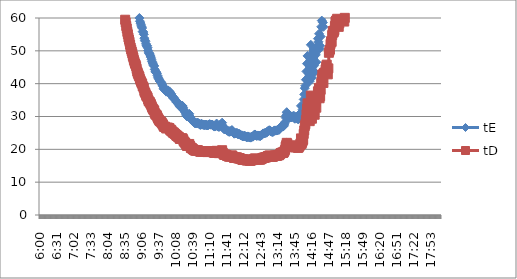
| Category | tE | tD |
|---|---|---|
| 0.25 | 17882.69 | 12549.256 |
| 0.25069444444444444 | 17882.69 | 12549.256 |
| 0.2513888888888889 | 17882.69 | 12549.256 |
| 0.2520833333333333 | 17882.69 | 12549.256 |
| 0.25277777777777777 | 17882.69 | 12549.256 |
| 0.2534722222222222 | 17882.69 | 12549.256 |
| 0.25416666666666665 | 17882.69 | 12549.256 |
| 0.2548611111111111 | 17882.69 | 12549.256 |
| 0.2555555555555556 | 17882.69 | 12549.256 |
| 0.25625000000000003 | 17882.69 | 12549.256 |
| 0.2569444444444445 | 17882.69 | 12549.256 |
| 0.2576388888888889 | 17882.69 | 12549.256 |
| 0.25833333333333336 | 17882.69 | 12549.256 |
| 0.2590277777777778 | 8941.345 | 6274.628 |
| 0.25972222222222224 | 8941.345 | 6274.628 |
| 0.2604166666666667 | 8941.345 | 6274.628 |
| 0.2611111111111111 | 8941.345 | 6274.628 |
| 0.26180555555555557 | 8941.345 | 6274.628 |
| 0.2625 | 8941.345 | 6274.628 |
| 0.26319444444444445 | 5960.897 | 4183.085 |
| 0.2638888888888889 | 5960.897 | 4183.085 |
| 0.26458333333333334 | 5960.897 | 4183.085 |
| 0.2652777777777778 | 5960.897 | 4183.085 |
| 0.2659722222222222 | 5960.897 | 4183.085 |
| 0.26666666666666666 | 5960.897 | 4183.085 |
| 0.2673611111111111 | 4470.672 | 3137.314 |
| 0.26805555555555555 | 4470.672 | 3137.314 |
| 0.26875 | 4470.672 | 3137.314 |
| 0.26944444444444443 | 4470.672 | 3137.314 |
| 0.2701388888888889 | 3576.538 | 2509.851 |
| 0.2708333333333333 | 3576.538 | 2509.851 |
| 0.27152777777777776 | 3576.538 | 2509.851 |
| 0.2722222222222222 | 2980.448 | 2091.543 |
| 0.27291666666666664 | 2980.448 | 2091.543 |
| 0.2736111111111111 | 2980.448 | 2091.543 |
| 0.2743055555555555 | 2554.67 | 1792.751 |
| 0.27499999999999997 | 2554.67 | 1792.751 |
| 0.27569444444444446 | 2554.67 | 1792.751 |
| 0.27638888888888885 | 2235.336 | 1568.657 |
| 0.27708333333333335 | 2235.336 | 1568.657 |
| 0.2777777777777778 | 1986.966 | 1394.362 |
| 0.27847222222222223 | 1986.966 | 1394.362 |
| 0.2791666666666667 | 1788.269 | 1254.926 |
| 0.2798611111111111 | 1788.269 | 1254.926 |
| 0.28055555555555556 | 1625.699 | 1140.841 |
| 0.28125 | 1625.699 | 1140.841 |
| 0.28194444444444444 | 1490.224 | 1045.771 |
| 0.2826388888888889 | 1490.224 | 1045.771 |
| 0.2833333333333333 | 1375.592 | 965.327 |
| 0.28402777777777777 | 1277.335 | 896.375 |
| 0.2847222222222222 | 1277.335 | 896.375 |
| 0.28541666666666665 | 1192.179 | 836.617 |
| 0.28611111111111115 | 1117.668 | 784.328 |
| 0.28680555555555554 | 1051.923 | 738.192 |
| 0.28750000000000003 | 1051.923 | 738.192 |
| 0.2881944444444445 | 993.483 | 697.181 |
| 0.2888888888888889 | 941.194 | 660.487 |
| 0.28958333333333336 | 894.134 | 627.463 |
| 0.2902777777777778 | 851.557 | 597.584 |
| 0.29097222222222224 | 812.85 | 570.421 |
| 0.2916666666666667 | 777.508 | 545.62 |
| 0.2923611111111111 | 745.112 | 522.886 |
| 0.29305555555555557 | 715.308 | 501.97 |
| 0.29375 | 687.796 | 482.664 |
| 0.29444444444444445 | 662.322 | 464.787 |
| 0.2951388888888889 | 638.667 | 448.188 |
| 0.29583333333333334 | 616.644 | 432.733 |
| 0.2965277777777778 | 596.09 | 418.309 |
| 0.2972222222222222 | 576.861 | 404.815 |
| 0.29791666666666666 | 558.834 | 392.164 |
| 0.2986111111111111 | 541.9 | 380.28 |
| 0.29930555555555555 | 525.961 | 369.096 |
| 0.3 | 510.934 | 358.55 |
| 0.30069444444444443 | 496.741 | 348.59 |
| 0.3013888888888889 | 483.316 | 339.169 |
| 0.3020833333333333 | 458.531 | 321.776 |
| 0.30277777777777776 | 447.067 | 313.731 |
| 0.3034722222222222 | 436.163 | 306.079 |
| 0.30416666666666664 | 425.778 | 298.792 |
| 0.3048611111111111 | 415.877 | 291.843 |
| 0.3055555555555555 | 406.425 | 285.21 |
| 0.30624999999999997 | 388.754 | 272.81 |
| 0.3069444444444444 | 380.483 | 267.005 |
| 0.3076388888888889 | 372.556 | 261.443 |
| 0.30833333333333335 | 364.953 | 256.107 |
| 0.3090277777777778 | 357.654 | 250.985 |
| 0.30972222222222223 | 343.898 | 241.332 |
| 0.3104166666666667 | 337.409 | 236.778 |
| 0.3111111111111111 | 331.161 | 232.394 |
| 0.31180555555555556 | 319.334 | 224.094 |
| 0.3125 | 313.731 | 220.162 |
| 0.31319444444444444 | 308.322 | 216.366 |
| 0.3138888888888889 | 298.045 | 209.154 |
| 0.3145833333333333 | 293.159 | 205.726 |
| 0.31527777777777777 | 283.852 | 199.195 |
| 0.3159722222222222 | 279.417 | 196.082 |
| 0.31666666666666665 | 270.95 | 190.14 |
| 0.31736111111111115 | 262.981 | 184.548 |
| 0.31805555555555554 | 251.869 | 176.75 |
| 0.31875000000000003 | 241.658 | 169.585 |
| 0.3194444444444445 | 226.363 | 158.851 |
| 0.3201388888888889 | 215.454 | 151.196 |
| 0.32083333333333336 | 207.938 | 145.922 |
| 0.3215277777777778 | 203.212 | 142.605 |
| 0.32222222222222224 | 196.513 | 137.904 |
| 0.3229166666666667 | 190.241 | 133.503 |
| 0.3236111111111111 | 184.358 | 129.374 |
| 0.32430555555555557 | 178.827 | 125.493 |
| 0.325 | 175.32 | 123.032 |
| 0.32569444444444445 | 170.311 | 119.517 |
| 0.3263888888888889 | 165.58 | 116.197 |
| 0.32708333333333334 | 161.105 | 113.056 |
| 0.3277777777777778 | 156.866 | 110.081 |
| 0.3284722222222222 | 152.844 | 107.259 |
| 0.32916666666666666 | 149.022 | 104.577 |
| 0.3298611111111111 | 145.388 | 102.026 |
| 0.33055555555555555 | 141.926 | 99.597 |
| 0.33125 | 138.626 | 97.281 |
| 0.33194444444444443 | 135.475 | 95.07 |
| 0.3326388888888889 | 133.453 | 93.651 |
| 0.3333333333333333 | 130.531 | 91.6 |
| 0.3340277777777778 | 128.652 | 90.282 |
| 0.3347222222222222 | 126.828 | 89.002 |
| 0.3354166666666667 | 125.054 | 87.757 |
| 0.3361111111111111 | 123.329 | 86.547 |
| 0.3368055555555556 | 122.484 | 85.954 |
| 0.33749999999999997 | 121.651 | 85.369 |
| 0.33819444444444446 | 119.218 | 83.662 |
| 0.33888888888888885 | 117.649 | 82.561 |
| 0.33958333333333335 | 116.121 | 81.489 |
| 0.34027777777777773 | 115.372 | 80.963 |
| 0.34097222222222223 | 114.633 | 80.444 |
| 0.3416666666666666 | 113.182 | 79.426 |
| 0.3423611111111111 | 111.767 | 78.433 |
| 0.3430555555555555 | 111.073 | 77.946 |
| 0.34375 | 109.71 | 76.989 |
| 0.3444444444444445 | 108.38 | 76.056 |
| 0.3451388888888889 | 107.082 | 75.145 |
| 0.3458333333333334 | 105.815 | 74.256 |
| 0.34652777777777777 | 103.969 | 72.961 |
| 0.34722222222222227 | 102.187 | 71.71 |
| 0.34791666666666665 | 101.032 | 70.9 |
| 0.34861111111111115 | 99.903 | 70.108 |
| 0.34930555555555554 | 98.257 | 68.952 |
| 0.35000000000000003 | 97.189 | 68.202 |
| 0.3506944444444444 | 95.629 | 67.108 |
| 0.3513888888888889 | 94.119 | 66.049 |
| 0.3520833333333333 | 93.139 | 65.361 |
| 0.3527777777777778 | 92.179 | 64.687 |
| 0.3534722222222222 | 91.238 | 64.027 |
| 0.3541666666666667 | 90.317 | 63.38 |
| 0.3548611111111111 | 88.969 | 62.434 |
| 0.35555555555555557 | 88.092 | 61.819 |
| 0.35625 | 86.809 | 60.919 |
| 0.35694444444444445 | 85.974 | 60.333 |
| 0.3576388888888889 | 84.752 | 59.475 |
| 0.35833333333333334 | 83.564 | 58.641 |
| 0.3590277777777778 | 82.031 | 57.565 |
| 0.3597222222222222 | 80.917 | 56.784 |
| 0.36041666666666666 | 79.479 | 55.774 |
| 0.3611111111111111 | 78.433 | 55.041 |
| 0.36180555555555555 | 77.081 | 54.092 |
| 0.3625 | 76.097 | 53.401 |
| 0.36319444444444443 | 75.137 | 52.728 |
| 0.3638888888888889 | 73.895 | 51.856 |
| 0.3645833333333333 | 72.694 | 51.013 |
| 0.3652777777777778 | 71.818 | 50.399 |
| 0.3659722222222222 | 70.963 | 49.799 |
| 0.3666666666666667 | 70.128 | 49.213 |
| 0.3673611111111111 | 69.045 | 48.453 |
| 0.3680555555555556 | 68.255 | 47.898 |
| 0.36874999999999997 | 67.228 | 47.178 |
| 0.36944444444444446 | 66.478 | 46.652 |
| 0.37013888888888885 | 65.745 | 46.137 |
| 0.37083333333333335 | 65.265 | 45.8 |
| 0.37152777777777773 | 64.558 | 45.304 |
| 0.37222222222222223 | 63.414 | 44.501 |
| 0.3729166666666666 | 62.309 | 43.726 |
| 0.3736111111111111 | 61.664 | 43.273 |
| 0.3743055555555555 | 61.033 | 42.83 |
| 0.375 | 60.414 | 42.396 |
| 0.3756944444444445 | 60.009 | 42.112 |
| 0.3763888888888889 | 59.019 | 41.417 |
| 0.3770833333333334 | 58.44 | 41.011 |
| 0.37777777777777777 | 57.873 | 40.612 |
| 0.37847222222222227 | 57.316 | 40.222 |
| 0.37916666666666665 | 56.951 | 39.966 |
| 0.37986111111111115 | 55.883 | 39.216 |
| 0.38055555555555554 | 55.709 | 39.094 |
| 0.38125000000000003 | 55.024 | 38.613 |
| 0.3819444444444444 | 53.864 | 37.799 |
| 0.3826388888888889 | 53.222 | 37.349 |
| 0.3833333333333333 | 52.907 | 37.128 |
| 0.3840277777777778 | 52.136 | 36.587 |
| 0.3847222222222222 | 51.535 | 36.165 |
| 0.3854166666666667 | 51.535 | 36.165 |
| 0.3861111111111111 | 50.948 | 35.753 |
| 0.38680555555555557 | 50.092 | 35.152 |
| 0.3875 | 49.4 | 34.666 |
| 0.38819444444444445 | 49.264 | 34.571 |
| 0.3888888888888889 | 48.994 | 34.382 |
| 0.38958333333333334 | 48.463 | 34.009 |
| 0.3902777777777778 | 48.072 | 33.735 |
| 0.3909722222222222 | 47.434 | 33.287 |
| 0.39166666666666666 | 46.813 | 32.851 |
| 0.3923611111111111 | 46.328 | 32.511 |
| 0.39305555555555555 | 45.971 | 32.26 |
| 0.39375 | 45.503 | 31.932 |
| 0.39444444444444443 | 45.388 | 31.851 |
| 0.3951388888888889 | 44.374 | 31.14 |
| 0.3958333333333333 | 43.83 | 30.758 |
| 0.3965277777777778 | 43.51 | 30.533 |
| 0.3972222222222222 | 43.51 | 30.533 |
| 0.3979166666666667 | 43.091 | 30.239 |
| 0.3986111111111111 | 42.477 | 29.808 |
| 0.3993055555555556 | 41.978 | 29.458 |
| 0.39999999999999997 | 41.588 | 29.184 |
| 0.40069444444444446 | 41.204 | 28.915 |
| 0.40138888888888885 | 40.828 | 28.651 |
| 0.40208333333333335 | 40.642 | 28.521 |
| 0.40277777777777773 | 40.55 | 28.456 |
| 0.40347222222222223 | 40.276 | 28.264 |
| 0.4041666666666666 | 39.917 | 28.012 |
| 0.4048611111111111 | 39.563 | 27.764 |
| 0.4055555555555555 | 39.216 | 27.52 |
| 0.40625 | 38.624 | 27.104 |
| 0.4069444444444445 | 38.293 | 26.872 |
| 0.4076388888888889 | 38.211 | 26.815 |
| 0.4083333333333334 | 38.293 | 26.872 |
| 0.40902777777777777 | 37.967 | 26.644 |
| 0.40972222222222227 | 37.569 | 26.364 |
| 0.41041666666666665 | 37.727 | 26.475 |
| 0.41111111111111115 | 37.727 | 26.475 |
| 0.41180555555555554 | 37.967 | 26.644 |
| 0.41250000000000003 | 37.727 | 26.475 |
| 0.4131944444444444 | 37.648 | 26.419 |
| 0.4138888888888889 | 37.648 | 26.419 |
| 0.4145833333333333 | 37.024 | 25.982 |
| 0.4152777777777778 | 36.645 | 25.716 |
| 0.4159722222222222 | 36.948 | 25.928 |
| 0.4166666666666667 | 36.347 | 25.507 |
| 0.4173611111111111 | 36.2 | 25.403 |
| 0.41805555555555557 | 35.981 | 25.25 |
| 0.41875 | 35.552 | 24.949 |
| 0.41944444444444445 | 35.694 | 25.048 |
| 0.4201388888888889 | 35.341 | 24.801 |
| 0.42083333333333334 | 35.202 | 24.703 |
| 0.4215277777777778 | 34.995 | 24.558 |
| 0.4222222222222222 | 34.724 | 24.367 |
| 0.42291666666666666 | 34.324 | 24.087 |
| 0.4236111111111111 | 34.456 | 24.18 |
| 0.42430555555555555 | 34.127 | 23.949 |
| 0.425 | 33.805 | 23.723 |
| 0.42569444444444443 | 33.869 | 23.768 |
| 0.4263888888888889 | 33.426 | 23.457 |
| 0.4270833333333333 | 32.994 | 23.154 |
| 0.4277777777777778 | 33.055 | 23.196 |
| 0.4284722222222222 | 33.116 | 23.239 |
| 0.4291666666666667 | 33.055 | 23.196 |
| 0.4298611111111111 | 33.301 | 23.369 |
| 0.4305555555555556 | 33.178 | 23.282 |
| 0.43124999999999997 | 32.633 | 22.9 |
| 0.43194444444444446 | 31.933 | 22.409 |
| 0.43263888888888885 | 31.82 | 22.33 |
| 0.43333333333333335 | 31.428 | 22.055 |
| 0.43402777777777773 | 31.209 | 21.901 |
| 0.43472222222222223 | 30.726 | 21.562 |
| 0.4354166666666666 | 30.258 | 21.234 |
| 0.4361111111111111 | 30.005 | 21.056 |
| 0.4368055555555555 | 30.055 | 21.091 |
| 0.4375 | 30.413 | 21.342 |
| 0.4381944444444445 | 30.465 | 21.379 |
| 0.4388888888888889 | 30.832 | 21.637 |
| 0.4395833333333334 | 30.055 | 21.091 |
| 0.44027777777777777 | 29.755 | 20.881 |
| 0.44097222222222227 | 29.125 | 20.439 |
| 0.44166666666666665 | 29.03 | 20.372 |
| 0.44236111111111115 | 29.03 | 20.372 |
| 0.44305555555555554 | 28.704 | 20.143 |
| 0.44375000000000003 | 28.521 | 20.015 |
| 0.4444444444444444 | 28.385 | 19.919 |
| 0.4451388888888889 | 28.206 | 19.794 |
| 0.4458333333333333 | 27.985 | 19.639 |
| 0.4465277777777778 | 27.985 | 19.639 |
| 0.4472222222222222 | 27.942 | 19.608 |
| 0.4479166666666667 | 27.985 | 19.639 |
| 0.4486111111111111 | 27.985 | 19.639 |
| 0.44930555555555557 | 28.073 | 19.701 |
| 0.45 | 28.073 | 19.701 |
| 0.45069444444444445 | 27.855 | 19.547 |
| 0.4513888888888889 | 27.725 | 19.456 |
| 0.45208333333333334 | 27.768 | 19.486 |
| 0.4527777777777778 | 27.47 | 19.277 |
| 0.4534722222222222 | 27.47 | 19.277 |
| 0.45416666666666666 | 27.768 | 19.486 |
| 0.4548611111111111 | 27.682 | 19.426 |
| 0.45555555555555555 | 27.597 | 19.366 |
| 0.45625 | 27.512 | 19.307 |
| 0.45694444444444443 | 27.47 | 19.277 |
| 0.4576388888888889 | 27.427 | 19.247 |
| 0.4583333333333333 | 27.427 | 19.247 |
| 0.4590277777777778 | 27.427 | 19.247 |
| 0.4597222222222222 | 27.512 | 19.307 |
| 0.4604166666666667 | 27.47 | 19.277 |
| 0.4611111111111111 | 27.344 | 19.188 |
| 0.4618055555555556 | 27.302 | 19.159 |
| 0.46249999999999997 | 27.344 | 19.188 |
| 0.46319444444444446 | 27.427 | 19.247 |
| 0.46388888888888885 | 27.554 | 19.336 |
| 0.46458333333333335 | 27.682 | 19.426 |
| 0.46527777777777773 | 27.597 | 19.366 |
| 0.46597222222222223 | 27.512 | 19.307 |
| 0.4666666666666666 | 27.554 | 19.336 |
| 0.4673611111111111 | 27.512 | 19.307 |
| 0.4680555555555555 | 27.554 | 19.336 |
| 0.46875 | 27.302 | 19.159 |
| 0.4694444444444445 | 27.219 | 19.101 |
| 0.4701388888888889 | 27.095 | 19.014 |
| 0.4708333333333334 | 26.932 | 18.899 |
| 0.47152777777777777 | 27.095 | 19.014 |
| 0.47222222222222227 | 27.054 | 18.985 |
| 0.47291666666666665 | 27.177 | 19.072 |
| 0.47361111111111115 | 27.855 | 19.547 |
| 0.47430555555555554 | 27.344 | 19.188 |
| 0.47500000000000003 | 27.013 | 18.957 |
| 0.4756944444444444 | 26.932 | 18.899 |
| 0.4763888888888889 | 26.851 | 18.843 |
| 0.4770833333333333 | 26.891 | 18.871 |
| 0.4777777777777778 | 27.385 | 19.218 |
| 0.4784722222222222 | 27.26 | 19.13 |
| 0.4791666666666667 | 27.512 | 19.307 |
| 0.4798611111111111 | 27.554 | 19.336 |
| 0.48055555555555557 | 28.117 | 19.732 |
| 0.48125 | 27.136 | 19.043 |
| 0.48194444444444445 | 26.651 | 18.702 |
| 0.4826388888888889 | 26.259 | 18.428 |
| 0.48333333333333334 | 26.106 | 18.32 |
| 0.4840277777777778 | 26.221 | 18.401 |
| 0.4847222222222222 | 26.144 | 18.347 |
| 0.48541666666666666 | 26.068 | 18.293 |
| 0.4861111111111111 | 25.842 | 18.135 |
| 0.48680555555555555 | 25.73 | 18.056 |
| 0.4875 | 25.694 | 18.031 |
| 0.48819444444444443 | 25.583 | 17.953 |
| 0.4888888888888889 | 25.402 | 17.826 |
| 0.4895833333333333 | 25.33 | 17.775 |
| 0.4902777777777778 | 25.547 | 17.928 |
| 0.4909722222222222 | 25.402 | 17.826 |
| 0.4916666666666667 | 25.438 | 17.851 |
| 0.4923611111111111 | 25.694 | 18.031 |
| 0.4930555555555556 | 25.879 | 18.161 |
| 0.49374999999999997 | 25.547 | 17.928 |
| 0.49444444444444446 | 25.366 | 17.8 |
| 0.49513888888888885 | 24.976 | 17.527 |
| 0.49583333333333335 | 24.768 | 17.381 |
| 0.49652777777777773 | 24.941 | 17.502 |
| 0.49722222222222223 | 24.941 | 17.502 |
| 0.4979166666666666 | 24.872 | 17.454 |
| 0.4986111111111111 | 24.837 | 17.43 |
| 0.4993055555555555 | 25.046 | 17.576 |
| 0.5 | 24.803 | 17.405 |
| 0.5006944444444444 | 24.564 | 17.238 |
| 0.5013888888888889 | 24.632 | 17.285 |
| 0.5020833333333333 | 24.666 | 17.309 |
| 0.5027777777777778 | 24.632 | 17.285 |
| 0.5034722222222222 | 24.43 | 17.144 |
| 0.5041666666666667 | 24.363 | 17.097 |
| 0.5048611111111111 | 24.231 | 17.004 |
| 0.5055555555555555 | 24.264 | 17.027 |
| 0.50625 | 23.971 | 16.822 |
| 0.5069444444444444 | 23.939 | 16.8 |
| 0.5076388888888889 | 23.971 | 16.822 |
| 0.5083333333333333 | 24.133 | 16.936 |
| 0.5090277777777777 | 24.036 | 16.867 |
| 0.5097222222222222 | 24.036 | 16.867 |
| 0.5104166666666666 | 23.907 | 16.777 |
| 0.5111111111111112 | 23.78 | 16.688 |
| 0.5118055555555555 | 23.686 | 16.622 |
| 0.5125000000000001 | 23.717 | 16.644 |
| 0.5131944444444444 | 23.939 | 16.8 |
| 0.513888888888889 | 23.907 | 16.777 |
| 0.5145833333333333 | 23.686 | 16.622 |
| 0.5152777777777778 | 23.654 | 16.6 |
| 0.5159722222222222 | 23.623 | 16.578 |
| 0.5166666666666667 | 23.561 | 16.534 |
| 0.517361111111111 | 23.78 | 16.688 |
| 0.5180555555555556 | 23.78 | 16.688 |
| 0.5187499999999999 | 23.875 | 16.755 |
| 0.5194444444444445 | 23.844 | 16.732 |
| 0.5201388888888888 | 23.939 | 16.8 |
| 0.5208333333333334 | 24.264 | 17.027 |
| 0.5215277777777778 | 24.43 | 17.144 |
| 0.5222222222222223 | 24.53 | 17.214 |
| 0.5229166666666667 | 24.397 | 17.12 |
| 0.5236111111111111 | 24.231 | 17.004 |
| 0.5243055555555556 | 24.101 | 16.913 |
| 0.525 | 24.166 | 16.958 |
| 0.5256944444444445 | 24.231 | 17.004 |
| 0.5263888888888889 | 24.166 | 16.958 |
| 0.5270833333333333 | 24.166 | 16.958 |
| 0.5277777777777778 | 24.133 | 16.936 |
| 0.5284722222222222 | 24.101 | 16.913 |
| 0.5291666666666667 | 24.068 | 16.89 |
| 0.5298611111111111 | 24.231 | 17.004 |
| 0.5305555555555556 | 24.43 | 17.144 |
| 0.53125 | 24.463 | 17.167 |
| 0.5319444444444444 | 24.734 | 17.357 |
| 0.5326388888888889 | 24.837 | 17.43 |
| 0.5333333333333333 | 24.837 | 17.43 |
| 0.5340277777777778 | 24.837 | 17.43 |
| 0.5347222222222222 | 24.941 | 17.502 |
| 0.5354166666666667 | 25.046 | 17.576 |
| 0.5361111111111111 | 25.046 | 17.576 |
| 0.5368055555555555 | 25.081 | 17.601 |
| 0.5375 | 25.222 | 17.7 |
| 0.5381944444444444 | 25.438 | 17.851 |
| 0.5388888888888889 | 25.62 | 17.979 |
| 0.5395833333333333 | 25.62 | 17.979 |
| 0.5402777777777777 | 25.805 | 18.109 |
| 0.5409722222222222 | 25.768 | 18.083 |
| 0.5416666666666666 | 25.62 | 17.979 |
| 0.5423611111111112 | 25.474 | 17.876 |
| 0.5430555555555555 | 25.438 | 17.851 |
| 0.5437500000000001 | 25.33 | 17.775 |
| 0.5444444444444444 | 25.33 | 17.775 |
| 0.545138888888889 | 25.33 | 17.775 |
| 0.5458333333333333 | 25.474 | 17.876 |
| 0.5465277777777778 | 25.694 | 18.031 |
| 0.5472222222222222 | 25.768 | 18.083 |
| 0.5479166666666667 | 25.73 | 18.056 |
| 0.548611111111111 | 25.694 | 18.031 |
| 0.5493055555555556 | 25.768 | 18.083 |
| 0.5499999999999999 | 25.768 | 18.083 |
| 0.5506944444444445 | 25.768 | 18.083 |
| 0.5513888888888888 | 25.917 | 18.187 |
| 0.5520833333333334 | 26.03 | 18.267 |
| 0.5527777777777778 | 25.955 | 18.214 |
| 0.5534722222222223 | 26.221 | 18.401 |
| 0.5541666666666667 | 26.493 | 18.591 |
| 0.5548611111111111 | 26.851 | 18.843 |
| 0.5555555555555556 | 26.891 | 18.871 |
| 0.55625 | 26.972 | 18.928 |
| 0.5569444444444445 | 27.177 | 19.072 |
| 0.5576388888888889 | 26.932 | 18.899 |
| 0.5583333333333333 | 27.013 | 18.957 |
| 0.5590277777777778 | 27.344 | 19.188 |
| 0.5597222222222222 | 27.768 | 19.486 |
| 0.5604166666666667 | 28.295 | 19.856 |
| 0.5611111111111111 | 29.656 | 20.811 |
| 0.5618055555555556 | 30.31 | 21.27 |
| 0.5625 | 31.318 | 21.978 |
| 0.5631944444444444 | 31.046 | 21.787 |
| 0.5638888888888889 | 30.005 | 21.056 |
| 0.5645833333333333 | 29.705 | 20.846 |
| 0.5652777777777778 | 29.755 | 20.881 |
| 0.5659722222222222 | 29.705 | 20.846 |
| 0.5666666666666667 | 29.755 | 20.881 |
| 0.5673611111111111 | 29.705 | 20.846 |
| 0.5680555555555555 | 29.705 | 20.846 |
| 0.56875 | 29.854 | 20.95 |
| 0.5694444444444444 | 30.055 | 21.091 |
| 0.5701388888888889 | 29.854 | 20.95 |
| 0.5708333333333333 | 30.055 | 21.091 |
| 0.5715277777777777 | 30.207 | 21.198 |
| 0.5722222222222222 | 29.461 | 20.674 |
| 0.5729166666666666 | 29.316 | 20.573 |
| 0.5736111111111112 | 29.804 | 20.915 |
| 0.5743055555555555 | 29.804 | 20.915 |
| 0.5750000000000001 | 29.607 | 20.777 |
| 0.5756944444444444 | 29.412 | 20.64 |
| 0.576388888888889 | 29.316 | 20.573 |
| 0.5770833333333333 | 29.125 | 20.439 |
| 0.5777777777777778 | 29.412 | 20.64 |
| 0.5784722222222222 | 29.854 | 20.95 |
| 0.5791666666666667 | 30.156 | 21.162 |
| 0.579861111111111 | 31.046 | 21.787 |
| 0.5805555555555556 | 33.239 | 23.326 |
| 0.5812499999999999 | 30.779 | 21.599 |
| 0.5819444444444445 | 31.373 | 22.016 |
| 0.5826388888888888 | 32.105 | 22.53 |
| 0.5833333333333334 | 32.633 | 22.9 |
| 0.5840277777777778 | 35.202 | 24.703 |
| 0.5847222222222223 | 36.72 | 25.768 |
| 0.5854166666666667 | 38.624 | 27.104 |
| 0.5861111111111111 | 39.389 | 27.642 |
| 0.5868055555555556 | 41.204 | 28.915 |
| 0.5875 | 43.723 | 30.683 |
| 0.5881944444444445 | 46.089 | 32.343 |
| 0.5888888888888889 | 48.463 | 34.009 |
| 0.5895833333333333 | 43.938 | 30.834 |
| 0.5902777777777778 | 43.195 | 30.312 |
| 0.5909722222222222 | 41.204 | 28.915 |
| 0.5916666666666667 | 40.735 | 28.586 |
| 0.5923611111111111 | 46.57 | 32.68 |
| 0.5930555555555556 | 51.834 | 36.375 |
| 0.59375 | 46.449 | 32.595 |
| 0.5944444444444444 | 41.782 | 29.321 |
| 0.5951388888888889 | 45.388 | 31.851 |
| 0.5958333333333333 | 48.072 | 33.735 |
| 0.5965277777777778 | 49.813 | 34.956 |
| 0.5972222222222222 | 45.503 | 31.932 |
| 0.5979166666666667 | 43.51 | 30.533 |
| 0.5986111111111111 | 48.594 | 34.101 |
| 0.5993055555555555 | 48.994 | 34.382 |
| 0.6 | 46.57 | 32.68 |
| 0.6006944444444444 | 50.659 | 35.55 |
| 0.6013888888888889 | 51.387 | 36.061 |
| 0.6020833333333333 | 53.702 | 37.685 |
| 0.6027777777777777 | 52.751 | 37.018 |
| 0.6034722222222222 | 55.193 | 38.732 |
| 0.6041666666666666 | 50.659 | 35.55 |
| 0.6048611111111112 | 51.535 | 36.165 |
| 0.6055555555555555 | 54.355 | 38.144 |
| 0.6062500000000001 | 57.316 | 40.222 |
| 0.6069444444444444 | 59.214 | 41.554 |
| 0.607638888888889 | 61.033 | 42.83 |
| 0.6083333333333333 | 58.632 | 41.145 |
| 0.6090277777777778 | 57.316 | 40.222 |
| 0.6097222222222222 | 61.664 | 43.273 |
| 0.6104166666666667 | 61.664 | 43.273 |
| 0.611111111111111 | 61.878 | 43.423 |
| 0.6118055555555556 | 63.19 | 44.344 |
| 0.6124999999999999 | 64.558 | 45.304 |
| 0.6131944444444445 | 65.265 | 45.8 |
| 0.6138888888888888 | 63.19 | 44.344 |
| 0.6145833333333334 | 61.033 | 42.83 |
| 0.6152777777777778 | 63.639 | 44.659 |
| 0.6159722222222223 | 70.404 | 49.407 |
| 0.6166666666666667 | 71.246 | 49.997 |
| 0.6173611111111111 | 71.818 | 50.399 |
| 0.6180555555555556 | 74.202 | 52.072 |
| 0.61875 | 75.454 | 52.95 |
| 0.6194444444444445 | 75.137 | 52.728 |
| 0.6201388888888889 | 78.09 | 54.8 |
| 0.6208333333333333 | 79.833 | 56.023 |
| 0.6215277777777778 | 79.127 | 55.528 |
| 0.6222222222222222 | 79.479 | 55.774 |
| 0.6229166666666667 | 80.191 | 56.275 |
| 0.6236111111111111 | 82.031 | 57.565 |
| 0.6243055555555556 | 83.956 | 58.917 |
| 0.625 | 84.352 | 59.195 |
| 0.6256944444444444 | 83.956 | 58.917 |
| 0.6263888888888889 | 85.156 | 59.758 |
| 0.6270833333333333 | 85.974 | 60.333 |
| 0.6277777777777778 | 83.564 | 58.641 |
| 0.6284722222222222 | 81.656 | 57.303 |
| 0.6291666666666667 | 83.175 | 58.369 |
| 0.6298611111111111 | 84.752 | 59.475 |
| 0.6305555555555555 | 86.809 | 60.919 |
| 0.63125 | 87.66 | 61.516 |
| 0.6319444444444444 | 86.39 | 60.624 |
| 0.6326388888888889 | 86.809 | 60.919 |
| 0.6333333333333333 | 88.528 | 62.125 |
| 0.6340277777777777 | 89.413 | 62.746 |
| 0.6347222222222222 | 85.974 | 60.333 |
| 0.6354166666666666 | 83.956 | 58.917 |
| 0.6361111111111112 | 85.563 | 60.044 |
| 0.6368055555555555 | 88.528 | 62.125 |
| 0.6375000000000001 | 88.528 | 62.125 |
| 0.6381944444444444 | 88.528 | 62.125 |
| 0.638888888888889 | 87.66 | 61.516 |
| 0.6395833333333333 | 88.092 | 61.819 |
| 0.6402777777777778 | 88.528 | 62.125 |
| 0.6409722222222222 | 89.863 | 63.062 |
| 0.6416666666666667 | 90.775 | 63.702 |
| 0.642361111111111 | 91.238 | 64.027 |
| 0.6430555555555556 | 93.139 | 65.361 |
| 0.6437499999999999 | 96.663 | 67.834 |
| 0.6444444444444445 | 99.903 | 70.108 |
| 0.6451388888888888 | 105.192 | 73.819 |
| 0.6458333333333334 | 109.041 | 76.52 |
| 0.6465277777777778 | 111.767 | 78.433 |
| 0.6472222222222223 | 113.902 | 79.932 |
| 0.6479166666666667 | 116.121 | 81.489 |
| 0.6486111111111111 | 118.428 | 83.108 |
| 0.6493055555555556 | 120.018 | 84.223 |
| 0.65 | 122.484 | 85.954 |
| 0.6506944444444445 | 124.185 | 87.148 |
| 0.6513888888888889 | 126.828 | 89.002 |
| 0.6520833333333333 | 129.585 | 90.937 |
| 0.6527777777777778 | 131.49 | 92.274 |
| 0.6534722222222222 | 133.453 | 93.651 |
| 0.6541666666666667 | 134.456 | 94.355 |
| 0.6548611111111111 | 135.475 | 95.07 |
| 0.6555555555555556 | 136.509 | 95.796 |
| 0.65625 | 137.559 | 96.533 |
| 0.6569444444444444 | 138.626 | 97.281 |
| 0.6576388888888889 | 140.809 | 98.813 |
| 0.6583333333333333 | 141.926 | 99.597 |
| 0.6590277777777778 | 143.062 | 100.394 |
| 0.6597222222222222 | 144.215 | 101.204 |
| 0.6604166666666667 | 145.388 | 102.026 |
| 0.6611111111111111 | 147.791 | 103.713 |
| 0.6618055555555555 | 150.275 | 105.456 |
| 0.6625 | 151.548 | 106.35 |
| 0.6631944444444444 | 152.844 | 107.259 |
| 0.6638888888888889 | 154.161 | 108.183 |
| 0.6645833333333333 | 156.866 | 110.081 |
| 0.6652777777777777 | 156.866 | 110.081 |
| 0.6659722222222222 | 158.254 | 111.055 |
| 0.6666666666666666 | 159.667 | 112.047 |
| 0.6673611111111111 | 159.667 | 112.047 |
| 0.6680555555555556 | 161.105 | 113.056 |
| 0.6687500000000001 | 162.57 | 114.084 |
| 0.6694444444444444 | 165.58 | 116.197 |
| 0.6701388888888888 | 167.128 | 117.283 |
| 0.6708333333333334 | 168.705 | 118.389 |
| 0.6715277777777778 | 170.311 | 119.517 |
| 0.6722222222222222 | 171.949 | 120.666 |
| 0.6729166666666666 | 173.618 | 121.837 |
| 0.6736111111111112 | 173.618 | 121.837 |
| 0.6743055555555556 | 173.618 | 121.837 |
| 0.6749999999999999 | 175.32 | 123.032 |
| 0.6756944444444444 | 175.32 | 123.032 |
| 0.6763888888888889 | 175.32 | 123.032 |
| 0.6770833333333334 | 177.056 | 124.25 |
| 0.6777777777777777 | 178.827 | 125.493 |
| 0.6784722222222223 | 182.476 | 128.054 |
| 0.6791666666666667 | 184.358 | 129.374 |
| 0.6798611111111111 | 188.239 | 132.097 |
| 0.6805555555555555 | 190.241 | 133.503 |
| 0.68125 | 194.377 | 136.405 |
| 0.6819444444444445 | 198.697 | 139.436 |
| 0.6826388888888889 | 200.929 | 141.003 |
| 0.6833333333333332 | 203.212 | 142.605 |
| 0.6840277777777778 | 207.938 | 145.922 |
| 0.6847222222222222 | 210.385 | 147.638 |
| 0.6854166666666667 | 215.454 | 151.196 |
| 0.686111111111111 | 218.082 | 153.04 |
| 0.6868055555555556 | 223.534 | 156.866 |
| 0.6875 | 226.363 | 158.851 |
| 0.6881944444444444 | 232.243 | 162.977 |
| 0.688888888888889 | 235.299 | 165.122 |
| 0.6895833333333333 | 241.658 | 169.585 |
| 0.6902777777777778 | 248.371 | 174.295 |
| 0.6909722222222222 | 255.467 | 179.275 |
| 0.6916666666666668 | 262.981 | 184.548 |
| 0.6923611111111111 | 266.906 | 187.302 |
| 0.6930555555555555 | 275.118 | 193.065 |
| 0.69375 | 288.43 | 202.407 |
| 0.6944444444444445 | 298.045 | 209.154 |
| 0.6951388888888889 | 308.322 | 216.366 |
| 0.6958333333333333 | 319.334 | 224.094 |
| 0.6965277777777777 | 331.161 | 232.394 |
| 0.6972222222222223 | 343.898 | 241.332 |
| 0.6979166666666666 | 357.654 | 250.985 |
| 0.6986111111111111 | 364.953 | 256.107 |
| 0.6993055555555556 | 380.483 | 267.005 |
| 0.7000000000000001 | 388.754 | 272.81 |
| 0.7006944444444444 | 406.425 | 285.21 |
| 0.7013888888888888 | 415.877 | 291.843 |
| 0.7020833333333334 | 425.778 | 298.792 |
| 0.7027777777777778 | 447.067 | 313.731 |
| 0.7034722222222222 | 458.531 | 321.776 |
| 0.7041666666666666 | 470.597 | 330.244 |
| 0.7048611111111112 | 483.316 | 339.169 |
| 0.7055555555555556 | 496.741 | 348.59 |
| 0.7062499999999999 | 510.934 | 358.55 |
| 0.7069444444444444 | 525.961 | 369.096 |
| 0.7076388888888889 | 541.9 | 380.28 |
| 0.7083333333333334 | 558.834 | 392.164 |
| 0.7090277777777777 | 576.861 | 404.815 |
| 0.7097222222222223 | 596.09 | 418.309 |
| 0.7104166666666667 | 616.644 | 432.733 |
| 0.7111111111111111 | 616.644 | 432.733 |
| 0.7118055555555555 | 638.667 | 448.188 |
| 0.7125 | 662.322 | 464.787 |
| 0.7131944444444445 | 687.796 | 482.664 |
| 0.7138888888888889 | 687.796 | 482.664 |
| 0.7145833333333332 | 715.308 | 501.97 |
| 0.7152777777777778 | 745.112 | 522.886 |
| 0.7159722222222222 | 745.112 | 522.886 |
| 0.7166666666666667 | 777.508 | 545.62 |
| 0.717361111111111 | 812.85 | 570.421 |
| 0.7180555555555556 | 812.85 | 570.421 |
| 0.71875 | 851.557 | 597.584 |
| 0.7194444444444444 | 851.557 | 597.584 |
| 0.720138888888889 | 894.134 | 627.463 |
| 0.7208333333333333 | 941.194 | 660.487 |
| 0.7215277777777778 | 941.194 | 660.487 |
| 0.7222222222222222 | 993.483 | 697.181 |
| 0.7229166666666668 | 993.483 | 697.181 |
| 0.7236111111111111 | 1051.923 | 738.192 |
| 0.7243055555555555 | 1117.668 | 784.328 |
| 0.725 | 1117.668 | 784.328 |
| 0.7256944444444445 | 1192.179 | 836.617 |
| 0.7263888888888889 | 1192.179 | 836.617 |
| 0.7270833333333333 | 1277.335 | 896.375 |
| 0.7277777777777777 | 1277.335 | 896.375 |
| 0.7284722222222223 | 1375.592 | 965.327 |
| 0.7291666666666666 | 1490.224 | 1045.771 |
| 0.7298611111111111 | 1490.224 | 1045.771 |
| 0.7305555555555556 | 1625.699 | 1140.841 |
| 0.7312500000000001 | 1625.699 | 1140.841 |
| 0.7319444444444444 | 1788.269 | 1254.926 |
| 0.7326388888888888 | 1788.269 | 1254.926 |
| 0.7333333333333334 | 1986.966 | 1394.362 |
| 0.7340277777777778 | 1986.966 | 1394.362 |
| 0.7347222222222222 | 2235.336 | 1568.657 |
| 0.7354166666666666 | 2235.336 | 1568.657 |
| 0.7361111111111112 | 2554.67 | 1792.751 |
| 0.7368055555555556 | 2554.67 | 1792.751 |
| 0.7374999999999999 | 2980.448 | 2091.543 |
| 0.7381944444444444 | 2980.448 | 2091.543 |
| 0.7388888888888889 | 3576.538 | 2509.851 |
| 0.7395833333333334 | 3576.538 | 2509.851 |
| 0.7402777777777777 | 3576.538 | 2509.851 |
| 0.7409722222222223 | 4470.672 | 3137.314 |
| 0.7416666666666667 | 4470.672 | 3137.314 |
| 0.7423611111111111 | 4470.672 | 3137.314 |
| 0.7430555555555555 | 5960.897 | 4183.085 |
| 0.74375 | 5960.897 | 4183.085 |
| 0.7444444444444445 | 5960.897 | 4183.085 |
| 0.7451388888888889 | 5960.897 | 4183.085 |
| 0.7458333333333332 | 5960.897 | 4183.085 |
| 0.7465277777777778 | 8941.345 | 6274.628 |
| 0.7472222222222222 | 8941.345 | 6274.628 |
| 0.7479166666666667 | 8941.345 | 6274.628 |
| 0.748611111111111 | 8941.345 | 6274.628 |
| 0.7493055555555556 | 8941.345 | 6274.628 |
| 0.75 | 8941.345 | 6274.628 |
| 0.7506944444444444 | 8941.345 | 6274.628 |
| 0.751388888888889 | 17882.69 | 12549.256 |
| 0.7520833333333333 | 17882.69 | 12549.256 |
| 0.7527777777777778 | 17882.69 | 12549.256 |
| 0.7534722222222222 | 17882.69 | 12549.256 |
| 0.7541666666666668 | 17882.69 | 12549.256 |
| 0.7548611111111111 | 17882.69 | 12549.256 |
| 0.7555555555555555 | 17882.69 | 12549.256 |
| 0.75625 | 17882.69 | 12549.256 |
| 0.7569444444444445 | 17882.69 | 12549.256 |
| 0.7576388888888889 | 17882.69 | 12549.256 |
| 0.7583333333333333 | 17882.69 | 12549.256 |
| 0.7590277777777777 | 17882.69 | 12549.256 |